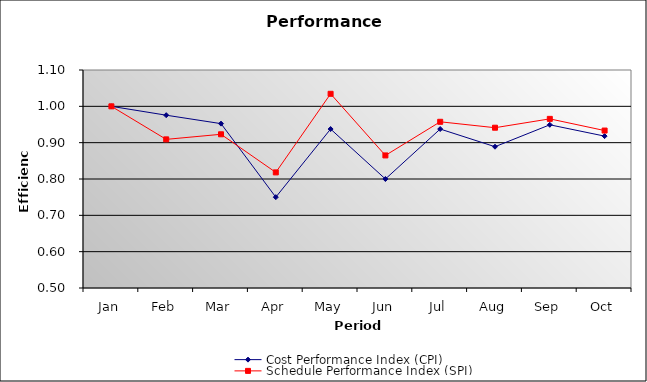
| Category | Cost Performance Index (CPI) | Schedule Performance Index (SPI) |
|---|---|---|
| Jan | 1 | 1 |
| Feb | 0.976 | 0.909 |
| Mar | 0.952 | 0.923 |
| Apr | 0.75 | 0.818 |
| May | 0.938 | 1.034 |
| Jun | 0.8 | 0.865 |
| Jul | 0.938 | 0.957 |
| Aug | 0.889 | 0.941 |
| Sep | 0.949 | 0.966 |
| Oct | 0.918 | 0.933 |